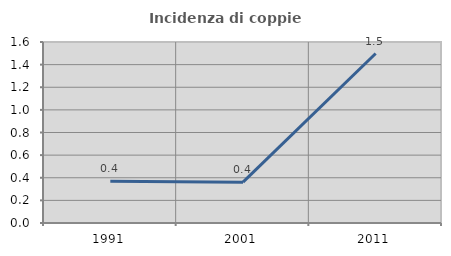
| Category | Incidenza di coppie miste |
|---|---|
| 1991.0 | 0.369 |
| 2001.0 | 0.361 |
| 2011.0 | 1.498 |